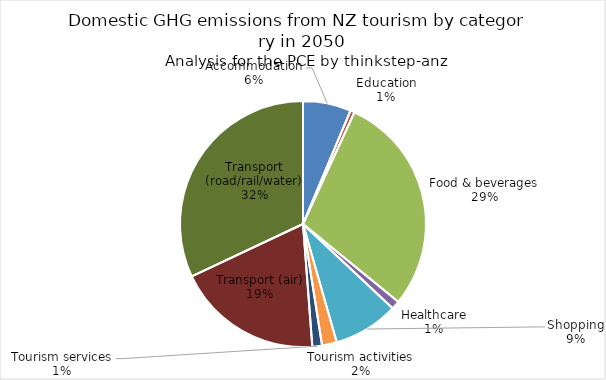
| Category | Series 0 |
|---|---|
| Accommodation | 253.34 |
| Education | 22.367 |
| Food & beverages | 1166.266 |
| Healthcare | 44.54 |
| Shopping | 344.253 |
| Tourism activities | 78.055 |
| Tourism services | 51.208 |
| Transport (air) | 771.339 |
| Transport (road/rail/water) | 1285.724 |